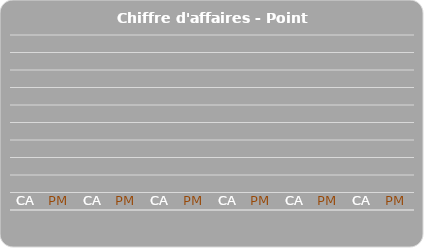
| Category | CA | PM |
|---|---|---|
|   | 0 | 0 |
|   | 0 | 0 |
|   | 0 | 0 |
|   | 0 | 0 |
|   | 0 | 0 |
|   | 0 | 0 |